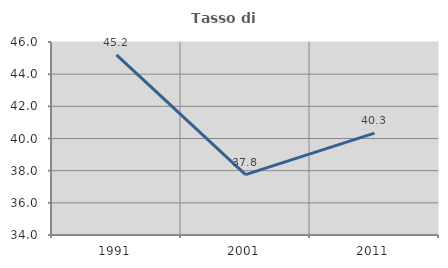
| Category | Tasso di occupazione   |
|---|---|
| 1991.0 | 45.201 |
| 2001.0 | 37.755 |
| 2011.0 | 40.336 |